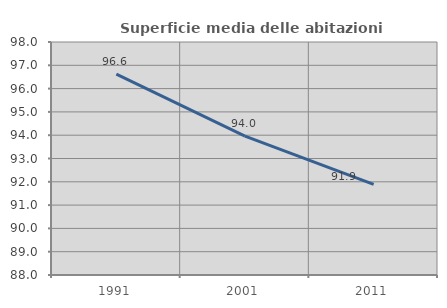
| Category | Superficie media delle abitazioni occupate |
|---|---|
| 1991.0 | 96.623 |
| 2001.0 | 93.963 |
| 2011.0 | 91.888 |